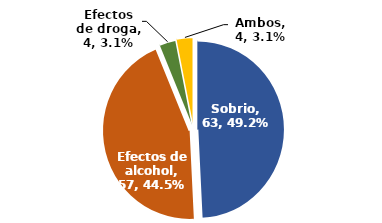
| Category | N° |
|---|---|
| Sobrio | 63 |
| Efectos de alcohol | 57 |
| Efectos de droga | 4 |
| Ambos | 4 |